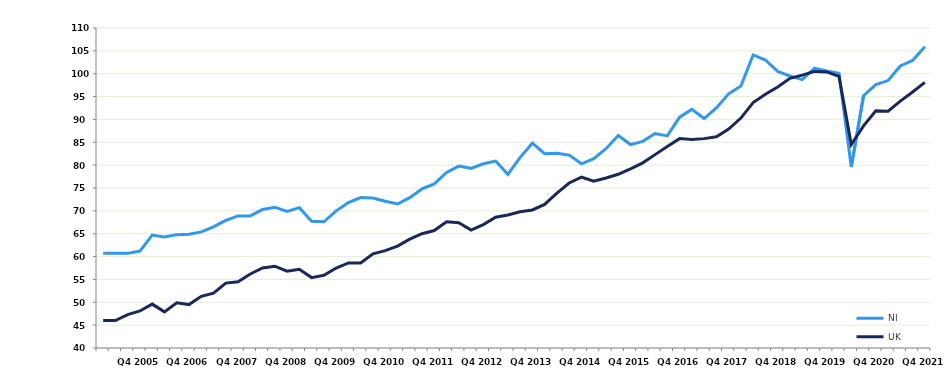
| Category | NI | UK |
|---|---|---|
|  | 60.7 | 46 |
|  | 60.7 | 46 |
|  | 60.7 | 47.3 |
| Q4 2005 | 61.2 | 48.1 |
|  | 64.7 | 49.6 |
|  | 64.3 | 47.9 |
|  | 64.8 | 49.9 |
| Q4 2006 | 64.9 | 49.5 |
|  | 65.4 | 51.3 |
|  | 66.5 | 52 |
|  | 67.9 | 54.2 |
| Q4 2007 | 68.9 | 54.5 |
|  | 68.9 | 56.2 |
|  | 70.3 | 57.5 |
|  | 70.8 | 57.9 |
| Q4 2008 | 69.9 | 56.8 |
|  | 70.7 | 57.2 |
|  | 67.7 | 55.4 |
|  | 67.6 | 55.9 |
| Q4 2009 | 70 | 57.5 |
|  | 71.8 | 58.6 |
|  | 72.9 | 58.6 |
|  | 72.8 | 60.6 |
| Q4 2010 | 72.1 | 61.3 |
|  | 71.5 | 62.3 |
|  | 72.9 | 63.8 |
|  | 74.8 | 65 |
| Q4 2011 | 75.9 | 65.7 |
|  | 78.4 | 67.6 |
|  | 79.8 | 67.4 |
|  | 79.3 | 65.8 |
| Q4 2012 | 80.3 | 67 |
|  | 80.9 | 68.6 |
|  | 78 | 69.1 |
|  | 81.7 | 69.8 |
| Q4 2013 | 84.8 | 70.2 |
|  | 82.5 | 71.4 |
|  | 82.6 | 73.9 |
|  | 82.2 | 76.1 |
| Q4 2014 | 80.3 | 77.4 |
|  | 81.4 | 76.5 |
|  | 83.6 | 77.2 |
|  | 86.5 | 78 |
| Q4 2015 | 84.5 | 79.2 |
|  | 85.2 | 80.5 |
|  | 86.9 | 82.3 |
|  | 86.4 | 84.1 |
| Q4 2016 | 90.5 | 85.8 |
|  | 92.2 | 85.6 |
|  | 90.2 | 85.8 |
|  | 92.5 | 86.2 |
| Q4 2017 | 95.6 | 87.9 |
|  | 97.3 | 90.3 |
|  | 104.1 | 93.7 |
|  | 103 | 95.5 |
| Q4 2018 | 100.5 | 97.1 |
|  | 99.5 | 99 |
|  | 98.7 | 99.7 |
|  | 101.2 | 100.5 |
| Q4 2019 | 100.6 | 100.4 |
|  | 100.1 | 99.4 |
|  | 79.6 | 84.5 |
|  | 95.2 | 88.6 |
| Q4 2020 | 97.6 | 91.9 |
|  | 98.5 | 91.8 |
|  | 101.7 | 94 |
|  | 102.9 | 96 |
| Q4 2021 | 105.9 | 98.1 |